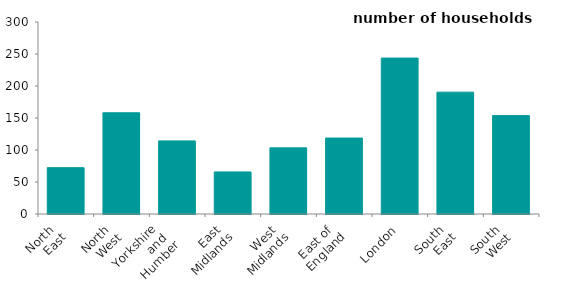
| Category | 2019-20 |
|---|---|
| North 
East | 72.412 |
| North 
West | 158.181 |
| Yorkshire 
and 
Humber | 114.203 |
| East 
Midlands | 65.717 |
| West 
Midlands | 103.349 |
| East of 
England | 118.668 |
| London | 243.615 |
| South 
East | 190.369 |
| South 
West | 153.764 |